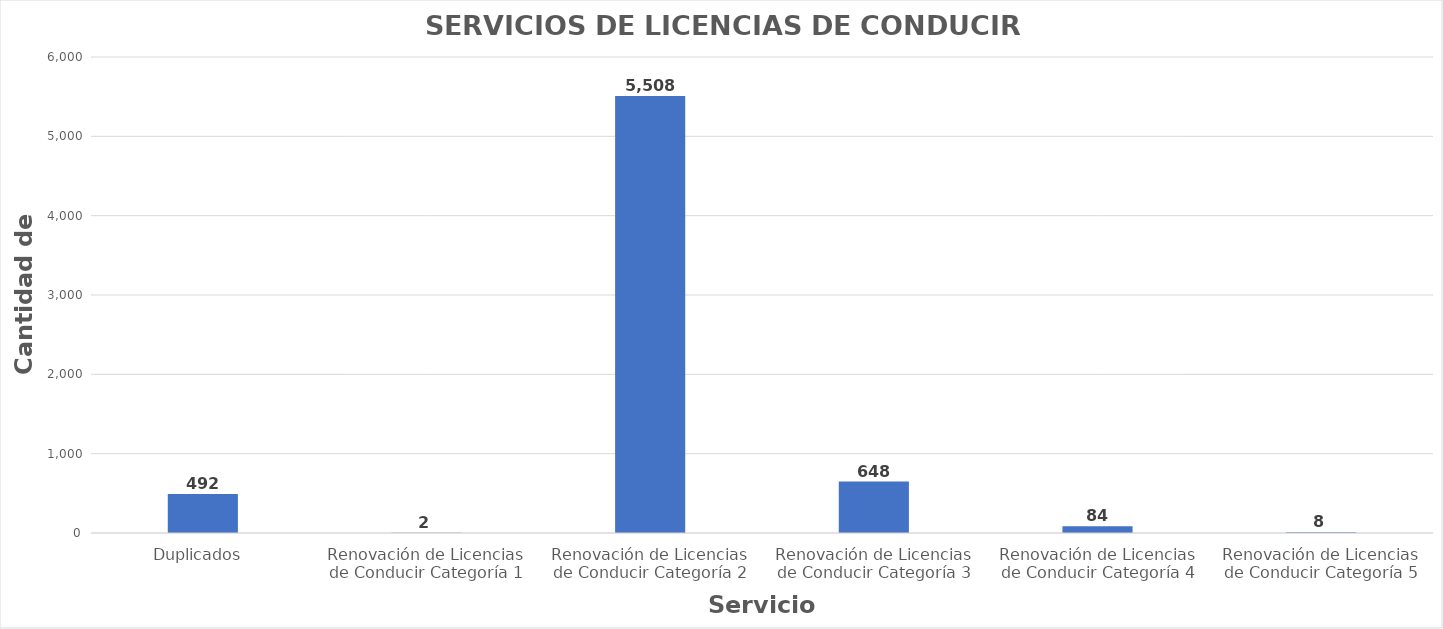
| Category | Series 0 |
|---|---|
| Duplicados  | 492 |
| Renovación de Licencias de Conducir Categoría 1 | 2 |
| Renovación de Licencias de Conducir Categoría 2 | 5508 |
| Renovación de Licencias de Conducir Categoría 3 | 648 |
| Renovación de Licencias de Conducir Categoría 4 | 84 |
| Renovación de Licencias de Conducir Categoría 5 | 8 |